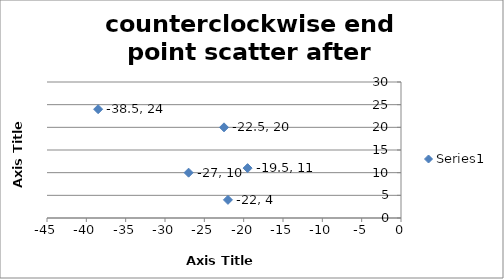
| Category | Series 0 |
|---|---|
| -38.5 | 24 |
| -27.0 | 10 |
| -19.5 | 11 |
| -22.5 | 20 |
| -22.0 | 4 |